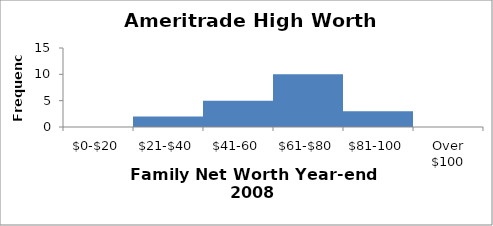
| Category | Frequency |
|---|---|
| $0-$20 | 0 |
| $21-$40 | 2 |
| $41-60 | 5 |
| $61-$80 | 10 |
| $81-100 | 3 |
| Over $100 | 0 |